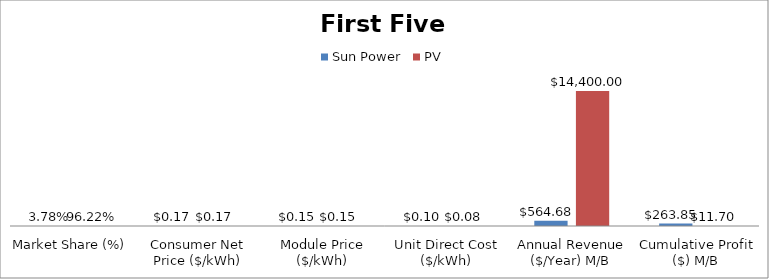
| Category | Sun Power | PV |
|---|---|---|
| Market Share (%) | 0.038 | 0.962 |
| Consumer Net Price ($/kWh) | 0.17 | 0.17 |
| Module Price ($/kWh) | 0.15 | 0.15 |
| Unit Direct Cost ($/kWh) | 0.1 | 0.08 |
| Annual Revenue ($/Year) M/B | 564.68 | 14400 |
| Cumulative Profit ($) M/B | 263.85 | 11.7 |